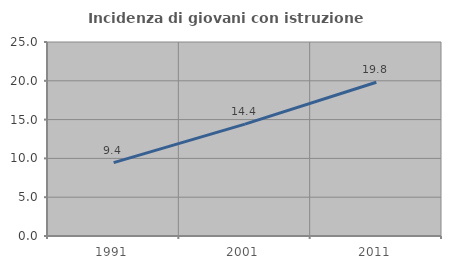
| Category | Incidenza di giovani con istruzione universitaria |
|---|---|
| 1991.0 | 9.449 |
| 2001.0 | 14.414 |
| 2011.0 | 19.811 |